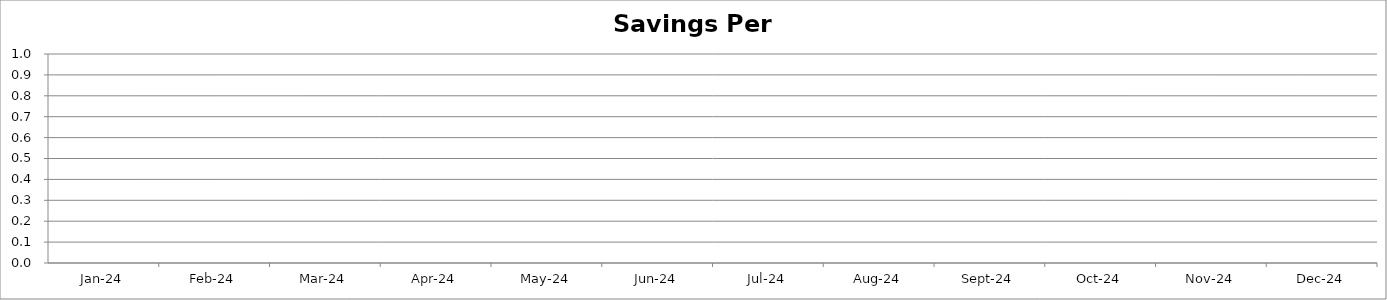
| Category | Series 0 |
|---|---|
| 2024-01-01 | 0 |
| 2024-02-01 | 0 |
| 2024-03-01 | 0 |
| 2024-04-01 | 0 |
| 2024-05-01 | 0 |
| 2024-06-01 | 0 |
| 2024-07-01 | 0 |
| 2024-08-01 | 0 |
| 2024-09-01 | 0 |
| 2024-10-01 | 0 |
| 2024-11-01 | 0 |
| 2024-12-01 | 0 |